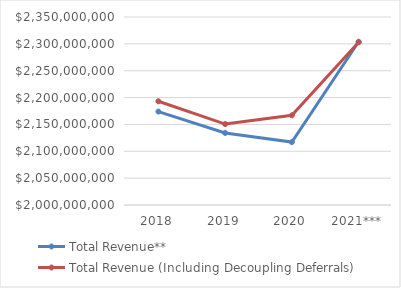
| Category | Total Revenue**  | Total Revenue (Including Decoupling Deferrals)  |
|---|---|---|
| 2018 | 2173933508.9 | 2193071805.065 |
| 2019 | 2134098222.99 | 2150663658.563 |
| 2020 | 2117110593.59 | 2166995034.782 |
| 2021*** | 2304002549.322 | 2302792933.675 |